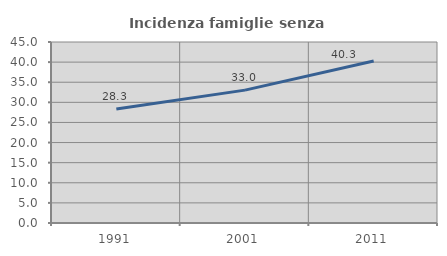
| Category | Incidenza famiglie senza nuclei |
|---|---|
| 1991.0 | 28.319 |
| 2001.0 | 33.032 |
| 2011.0 | 40.26 |